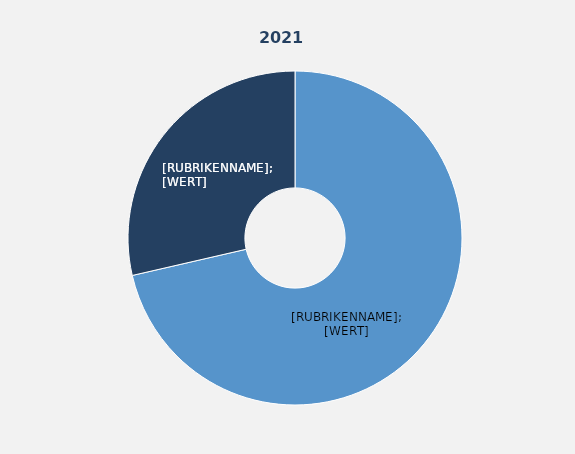
| Category | Series 1 |
|---|---|
| Vollzeitbeschäftigte | 71.4 |
| Teilzeitbeschäftigte | 28.6 |